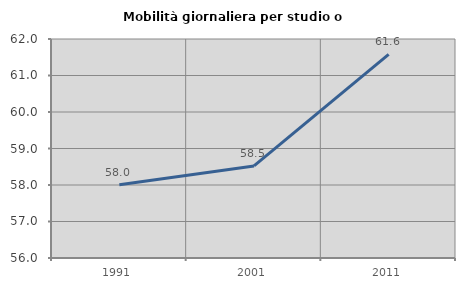
| Category | Mobilità giornaliera per studio o lavoro |
|---|---|
| 1991.0 | 58.009 |
| 2001.0 | 58.522 |
| 2011.0 | 61.578 |